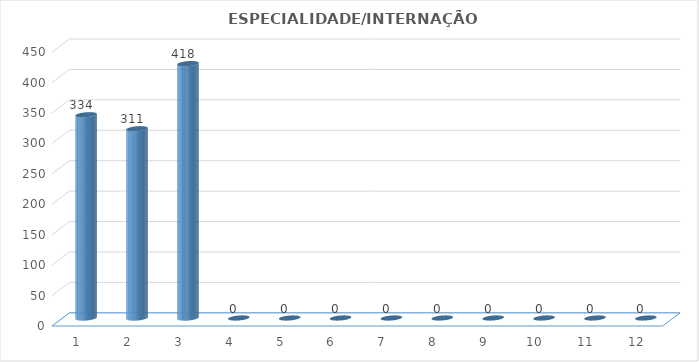
| Category | Series 0 |
|---|---|
| 0 | 334 |
| 1 | 311 |
| 2 | 418 |
| 3 | 0 |
| 4 | 0 |
| 5 | 0 |
| 6 | 0 |
| 7 | 0 |
| 8 | 0 |
| 9 | 0 |
| 10 | 0 |
| 11 | 0 |